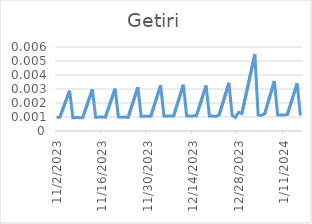
| Category | Getiri |
|---|---|
| 1/16/24 | 0.001 |
| 1/15/24 | 0.003 |
| 1/12/24 | 0.001 |
| 1/11/24 | 0.001 |
| 1/10/24 | 0.001 |
| 1/9/24 | 0.001 |
| 1/8/24 | 0.004 |
| 1/5/24 | 0.001 |
| 1/4/24 | 0.001 |
| 1/3/24 | 0.001 |
| 1/2/24 | 0.005 |
| 12/29/23 | 0.001 |
| 12/28/23 | 0.001 |
| 12/27/23 | 0.001 |
| 12/26/23 | 0.001 |
| 12/25/23 | 0.003 |
| 12/22/23 | 0.001 |
| 12/21/23 | 0.001 |
| 12/20/23 | 0.001 |
| 12/19/23 | 0.001 |
| 12/18/23 | 0.003 |
| 12/15/23 | 0.001 |
| 12/14/23 | 0.001 |
| 12/13/23 | 0.001 |
| 12/12/23 | 0.001 |
| 12/11/23 | 0.003 |
| 12/8/23 | 0.001 |
| 12/7/23 | 0.001 |
| 12/6/23 | 0.001 |
| 12/5/23 | 0.001 |
| 12/4/23 | 0.003 |
| 12/1/23 | 0.001 |
| 11/30/23 | 0.001 |
| 11/29/23 | 0.001 |
| 11/28/23 | 0.001 |
| 11/27/23 | 0.003 |
| 11/24/23 | 0.001 |
| 11/23/23 | 0.001 |
| 11/22/23 | 0.001 |
| 11/21/23 | 0.001 |
| 11/20/23 | 0.003 |
| 11/17/23 | 0.001 |
| 11/16/23 | 0.001 |
| 11/15/23 | 0.001 |
| 11/14/23 | 0.001 |
| 11/13/23 | 0.003 |
| 11/10/23 | 0.001 |
| 11/9/23 | 0.001 |
| 11/8/23 | 0.001 |
| 11/7/23 | 0.001 |
| 11/6/23 | 0.003 |
| 11/3/23 | 0.001 |
| 11/2/23 | 0.001 |